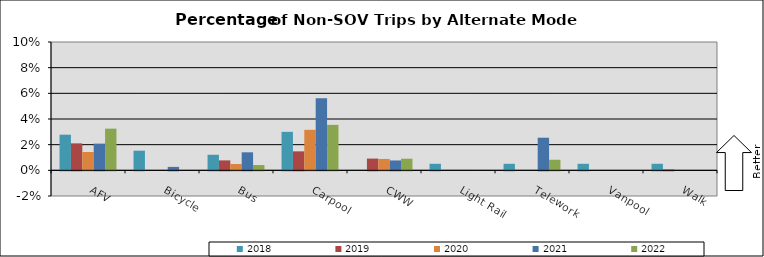
| Category | 2018 | 2019 | 2020 | 2021 | 2022 |
|---|---|---|---|---|---|
| AFV | 0.028 | 0.021 | 0.014 | 0.021 | 0.032 |
| Bicycle | 0.015 | 0 | 0 | 0.003 | 0 |
| Bus | 0.012 | 0.008 | 0.005 | 0.014 | 0.004 |
| Carpool | 0.03 | 0.015 | 0.032 | 0.056 | 0.035 |
| CWW | 0 | 0.009 | 0.009 | 0.008 | 0.009 |
| Light Rail | 0.005 | 0 | 0 | 0 | 0 |
| Telework | 0.005 | 0 | 0 | 0.025 | 0.008 |
| Vanpool | 0.005 | 0 | 0 | 0 | 0 |
| Walk | 0.005 | 0.001 | 0 | 0 | 0 |